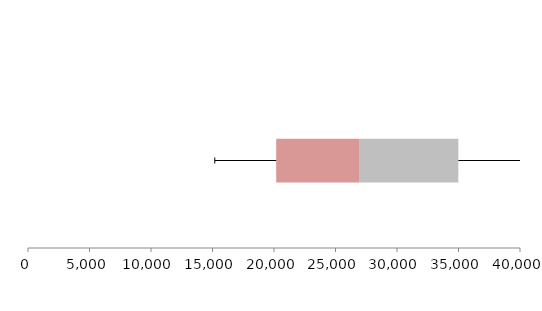
| Category | Series 1 | Series 2 | Series 3 |
|---|---|---|---|
| 0 | 20179.776 | 6735.339 | 8070.316 |